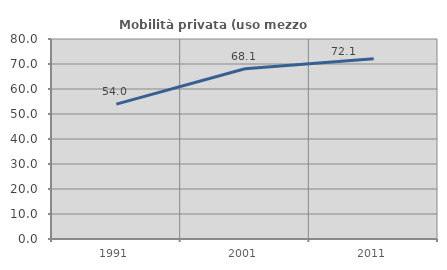
| Category | Mobilità privata (uso mezzo privato) |
|---|---|
| 1991.0 | 53.961 |
| 2001.0 | 68.09 |
| 2011.0 | 72.133 |